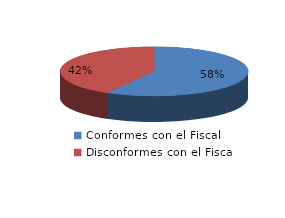
| Category | Series 0 |
|---|---|
| 0 | 768 |
| 1 | 554 |